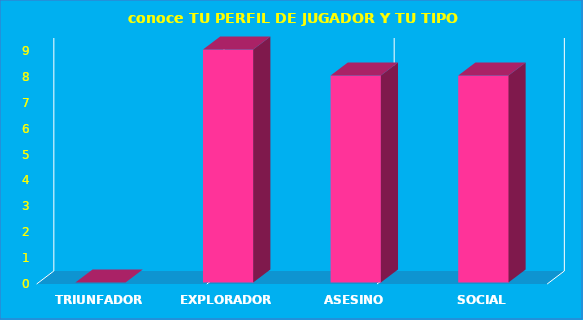
| Category | Series 0 |
|---|---|
| Triunfador | 0 |
| Explorador | 9 |
| Asesino | 8 |
| Social | 8 |